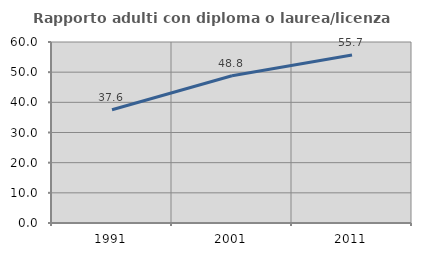
| Category | Rapporto adulti con diploma o laurea/licenza media  |
|---|---|
| 1991.0 | 37.551 |
| 2001.0 | 48.824 |
| 2011.0 | 55.676 |